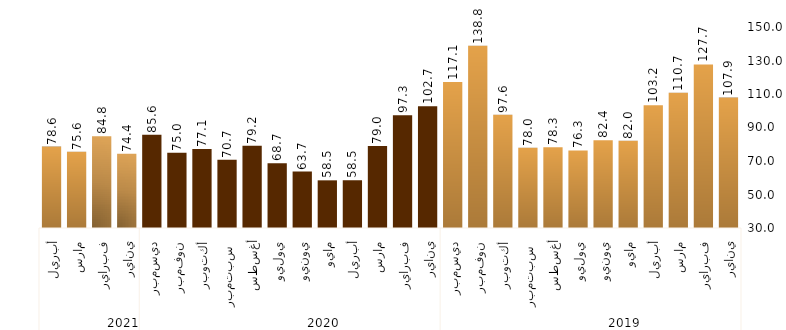
| Category | Series 0 |
|---|---|
| 0 | 107.861 |
| 1 | 127.674 |
| 2 | 110.742 |
| 3 | 103.239 |
| 4 | 82.016 |
| 5 | 82.421 |
| 6 | 76.314 |
| 7 | 78.265 |
| 8 | 77.961 |
| 9 | 97.566 |
| 10 | 138.85 |
| 11 | 117.091 |
| 12 | 102.678 |
| 13 | 97.332 |
| 14 | 78.955 |
| 15 | 58.549 |
| 16 | 58.455 |
| 17 | 63.691 |
| 18 | 68.721 |
| 19 | 79.161 |
| 20 | 70.692 |
| 21 | 77.111 |
| 22 | 74.955 |
| 23 | 85.627 |
| 24 | 74.378 |
| 25 | 84.831 |
| 26 | 75.573 |
| 27 | 78.621 |